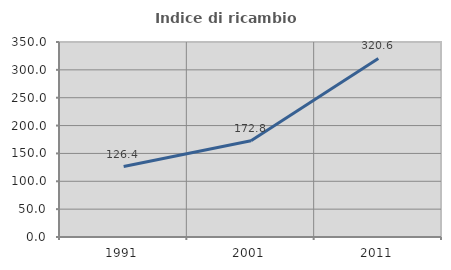
| Category | Indice di ricambio occupazionale  |
|---|---|
| 1991.0 | 126.392 |
| 2001.0 | 172.788 |
| 2011.0 | 320.561 |